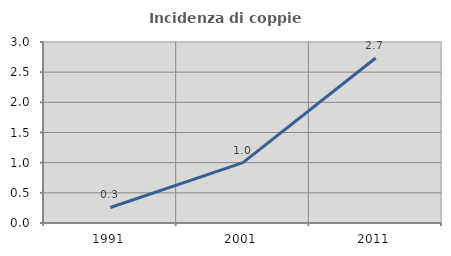
| Category | Incidenza di coppie miste |
|---|---|
| 1991.0 | 0.258 |
| 2001.0 | 1.001 |
| 2011.0 | 2.735 |